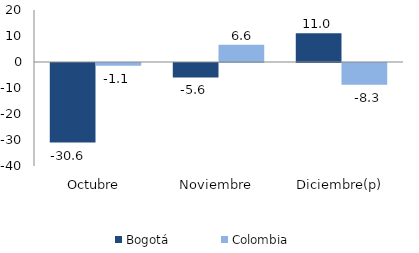
| Category | Bogotá | Colombia |
|---|---|---|
| Octubre | -30.589 | -1.094 |
| Noviembre | -5.576 | 6.609 |
| Diciembre(p) | 11.044 | -8.331 |